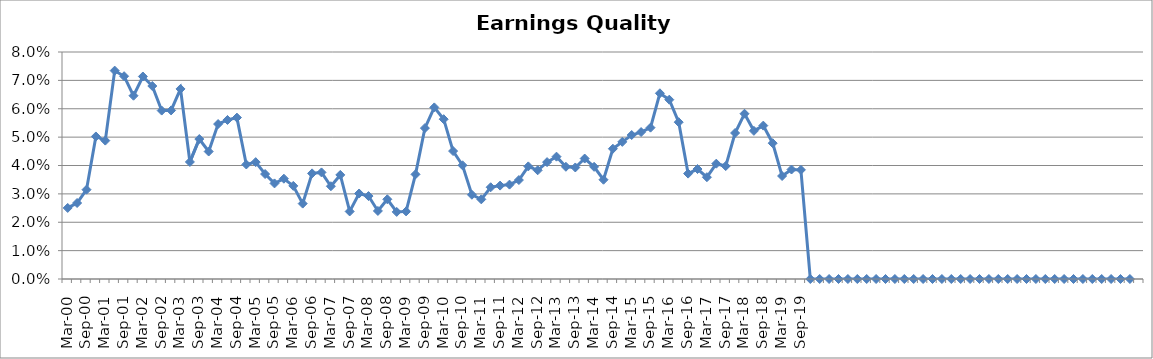
| Category | Rptd. Earnings Quality Indicator |
|---|---|
| Mar-00 | 0.025 |
| Jun-00 | 0.027 |
| Sep-00 | 0.031 |
| Dec-00 | 0.05 |
| Mar-01 | 0.049 |
| Jun-01 | 0.073 |
| Sep-01 | 0.071 |
| Dec-01 | 0.065 |
| Mar-02 | 0.071 |
| Jun-02 | 0.068 |
| Sep-02 | 0.059 |
| Dec-02 | 0.059 |
| Mar-03 | 0.067 |
| Jun-03 | 0.041 |
| Sep-03 | 0.049 |
| Dec-03 | 0.045 |
| Mar-04 | 0.055 |
| Jun-04 | 0.056 |
| Sep-04 | 0.057 |
| Dec-04 | 0.04 |
| Mar-05 | 0.041 |
| Jun-05 | 0.037 |
| Sep-05 | 0.034 |
| Dec-05 | 0.035 |
| Mar-06 | 0.033 |
| Jun-06 | 0.027 |
| Sep-06 | 0.037 |
| Dec-06 | 0.038 |
| Mar-07 | 0.033 |
| Jun-07 | 0.037 |
| Sep-07 | 0.024 |
| Dec-07 | 0.03 |
| Mar-08 | 0.029 |
| Jun-08 | 0.024 |
| Sep-08 | 0.028 |
| Dec-08 | 0.024 |
| Mar-09 | 0.024 |
| Jun-09 | 0.037 |
| Sep-09 | 0.053 |
| Dec-09 | 0.06 |
| Mar-10 | 0.056 |
| Jun-10 | 0.045 |
| Sep-10 | 0.04 |
| Dec-10 | 0.03 |
| Mar-11 | 0.028 |
| Jun-11 | 0.032 |
| Sep-11 | 0.033 |
| Dec-11 | 0.033 |
| Mar-12 | 0.035 |
| Jun-12 | 0.04 |
| Sep-12 | 0.038 |
| Dec-12 | 0.041 |
| Mar-13 | 0.043 |
| Jun-13 | 0.04 |
| Sep-13 | 0.039 |
| Dec-13 | 0.042 |
| Mar-14 | 0.04 |
| Jun-14 | 0.035 |
| Sep-14 | 0.046 |
| Dec-14 | 0.048 |
| Mar-15 | 0.051 |
| Jun-15 | 0.052 |
| Sep-15 | 0.053 |
| Dec-15 | 0.065 |
| Mar-16 | 0.063 |
| Jun-16 | 0.055 |
| Sep-16 | 0.037 |
| Dec-16 | 0.039 |
| Mar-17 | 0.036 |
| Jun-17 | 0.041 |
| Sep-17 | 0.04 |
| Dec-17 | 0.051 |
| Mar-18 | 0.058 |
| Jun-18 | 0.052 |
| Sep-18 | 0.054 |
| Dec-18 | 0.048 |
| Mar-19 | 0.036 |
| Jun-19 | 0.039 |
| Sep-19 | 0.038 |